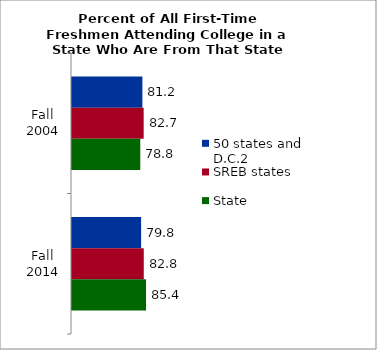
| Category | 50 states and D.C.2 | SREB states | State |
|---|---|---|---|
| Fall 2004 | 81.242 | 82.698 | 78.762 |
| Fall 2014 | 79.753 | 82.819 | 85.42 |